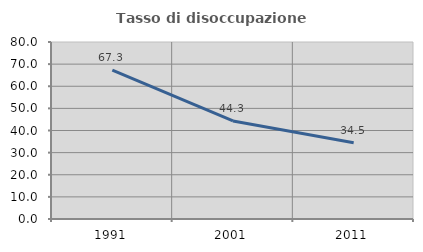
| Category | Tasso di disoccupazione giovanile  |
|---|---|
| 1991.0 | 67.297 |
| 2001.0 | 44.33 |
| 2011.0 | 34.483 |